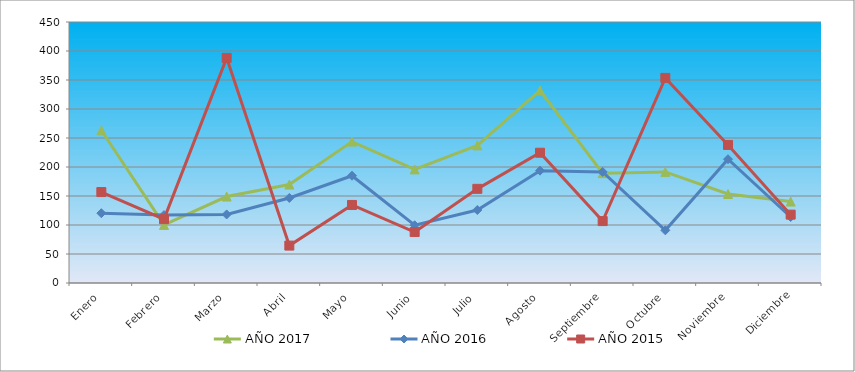
| Category | AÑO 2017 | AÑO 2016 | AÑO 2015 |
|---|---|---|---|
| Enero | 263.364 | 120.381 | 156.805 |
| Febrero | 100.122 | 117.098 | 110.097 |
| Marzo | 149.095 | 118.192 | 388.12 |
| Abril | 169.772 | 146.646 | 64.501 |
| Mayo | 243.775 | 184.949 | 134.563 |
| Junio | 195.891 | 99.588 | 87.855 |
| Julio | 237.245 | 125.853 | 162.365 |
| Agosto | 331.926 | 193.704 | 224.643 |
| Septiembre | 189.361 | 191.515 | 106.761 |
| Octubre | 191.538 | 90.833 | 353.645 |
| Noviembre | 153.448 | 213.403 | 237.988 |
| Diciembre | 140.388 | 113.815 | 117.882 |